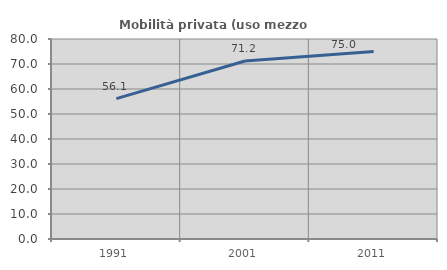
| Category | Mobilità privata (uso mezzo privato) |
|---|---|
| 1991.0 | 56.145 |
| 2001.0 | 71.193 |
| 2011.0 | 74.961 |